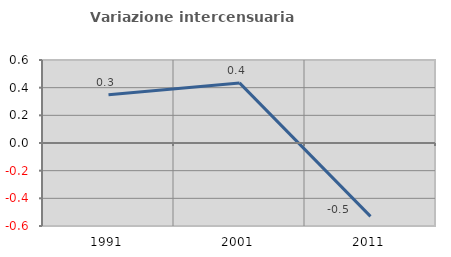
| Category | Variazione intercensuaria annua |
|---|---|
| 1991.0 | 0.348 |
| 2001.0 | 0.435 |
| 2011.0 | -0.531 |